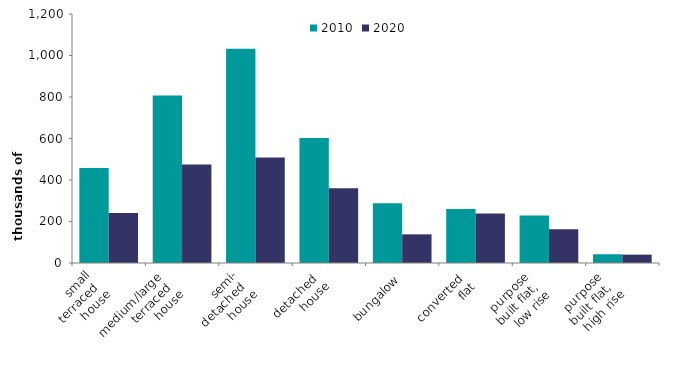
| Category | 2010 | 2020 |
|---|---|---|
| small
 terraced 
house | 458.148 | 240.665 |
| medium/large 
terraced 
house | 807.506 | 475.136 |
| semi-
detached 
house | 1032.091 | 508.624 |
| detached 
house | 602.953 | 360.652 |
| bungalow | 287.634 | 138.082 |
| converted 
flat | 260.799 | 238.042 |
| purpose 
built flat, 
low rise | 228.865 | 163.086 |
| purpose 
built flat, 
high rise | 42.132 | 40.338 |